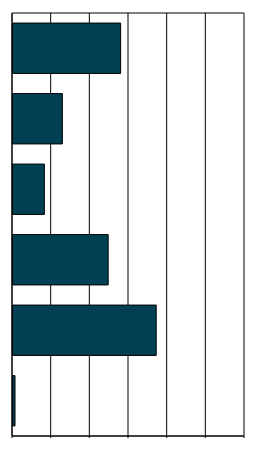
| Category | Series 0 |
|---|---|
| 0 | 1.046 |
| 1 | 74.075 |
| 2 | 49.233 |
| 3 | 16.226 |
| 4 | 25.531 |
| 5 | 55.669 |